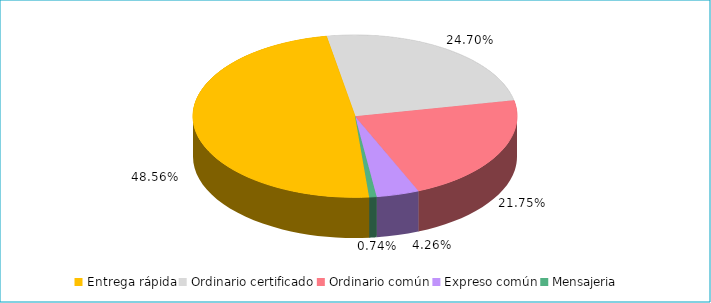
| Category | Series 0 |
|---|---|
| Entrega rápida | 0.486 |
| Ordinario certificado | 0.247 |
| Ordinario común | 0.217 |
| Expreso común | 0.043 |
| Mensajeria | 0.007 |